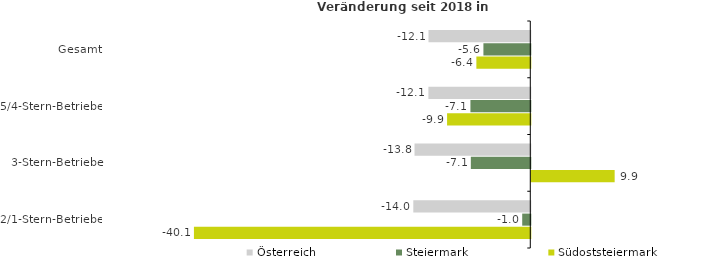
| Category | Österreich | Steiermark | Südoststeiermark |
|---|---|---|---|
| Gesamt | -12.137 | -5.59 | -6.429 |
| 5/4-Stern-Betriebe | -12.15 | -7.138 | -9.923 |
| 3-Stern-Betriebe | -13.805 | -7.09 | 9.942 |
| 2/1-Stern-Betriebe | -13.951 | -0.963 | -40.11 |